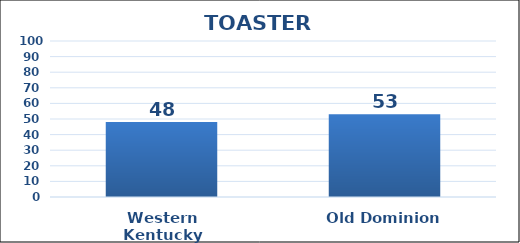
| Category | Series 0 |
|---|---|
| Western Kentucky | 48 |
| Old Dominion | 53 |